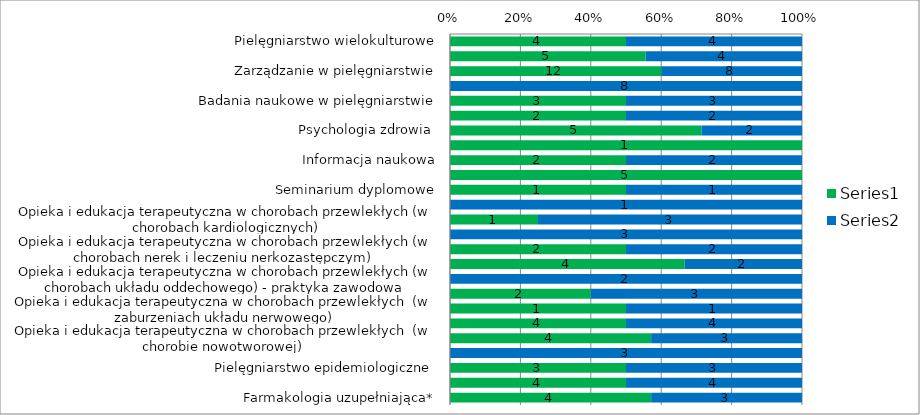
| Category | Series 0 | Series 1 |
|---|---|---|
| Pielęgniarstwo wielokulturowe | 4 | 4 |
| Prawo w praktyce pielęgniarskiej | 5 | 4 |
| Zarządzanie w pielęgniarstwie | 12 | 8 |
| Zarządzanie w pielęgniarstwie - praktyka zawodowa | 0 | 8 |
| Badania naukowe w pielęgniarstwie | 3 | 3 |
| Statystyka medyczna | 2 | 2 |
| Psychologia zdrowia  | 5 | 2 |
| Praktyka pielęgniarska oparta na dowodach naukowych  | 1 | 0 |
| Informacja naukowa | 2 | 2 |
| Pielęgniarstwo w perspektywie międzynarodowej | 5 | 0 |
| Seminarium dyplomowe | 1 | 1 |
| Język angielski | 0 | 1 |
| Opieka i edukacja terapeutyczna w chorobach przewlekłych (w chorobach kardiologicznych) | 1 | 3 |
| Opieka i edukacja terapeutyczna w chorobach przewlekłych (w chorobach kardiologicznych) - praktyka zawodowa | 0 | 3 |
| Opieka i edukacja terapeutyczna w chorobach przewlekłych (w chorobach nerek i leczeniu nerkozastępczym)  | 2 | 2 |
| Opieka i edukacja terapeutyczna w chorobach przewlekłych (w chorobach układu oddechowego) | 4 | 2 |
| Opieka i edukacja terapeutyczna w chorobach przewlekłych (w chorobach układu oddechowego) - praktyka zawodowa | 0 | 2 |
| Opieka i edukacja terapeutyczna wchorobach przewlekłych ( w diabetologii) | 2 | 3 |
| Opieka i edukacja terapeutyczna w chorobach przewlekłych  (w zaburzeniach układu nerwowego) | 1 | 1 |
| Opieka i edukacja terapeutyczna w chorobach przewlekłych zdrowotna (w zaburzeniach zdrowia psychicznego) | 4 | 4 |
| Opieka i edukacja terapeutyczna w chorobach przewlekłych  (w chorobie nowotworowej)  | 4 | 3 |
| Opieka i edukacja terapeutyczna w chorobach przewlekłych (w chorobie nowotworowej) - praktyka zawodowa | 0 | 3 |
| Pielęgniarstwo epidemiologiczne  | 3 | 3 |
| Farmakologia i ordynowanie produktów leczniczych | 4 | 4 |
| Farmakologia uzupełniająca* | 4 | 3 |